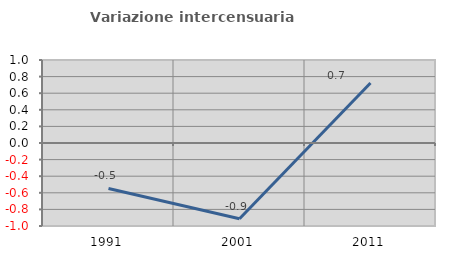
| Category | Variazione intercensuaria annua |
|---|---|
| 1991.0 | -0.548 |
| 2001.0 | -0.913 |
| 2011.0 | 0.724 |